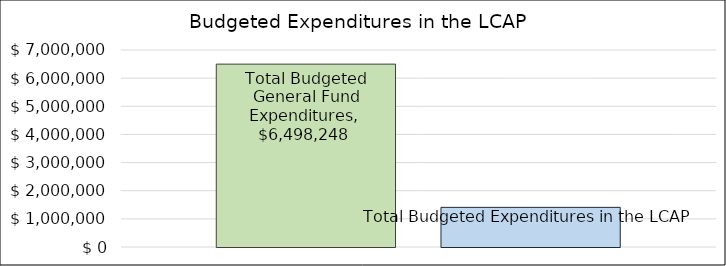
| Category | Total Budgeted General Fund Expenditures | Total Budgeted Expenditures in the LCAP |
|---|---|---|
| 0 | 6498248 | 1408345 |